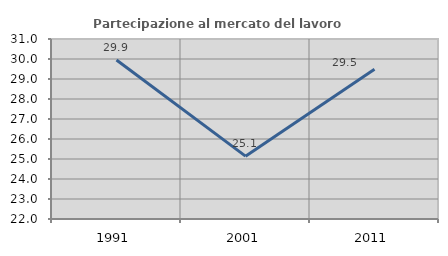
| Category | Partecipazione al mercato del lavoro  femminile |
|---|---|
| 1991.0 | 29.947 |
| 2001.0 | 25.142 |
| 2011.0 | 29.485 |